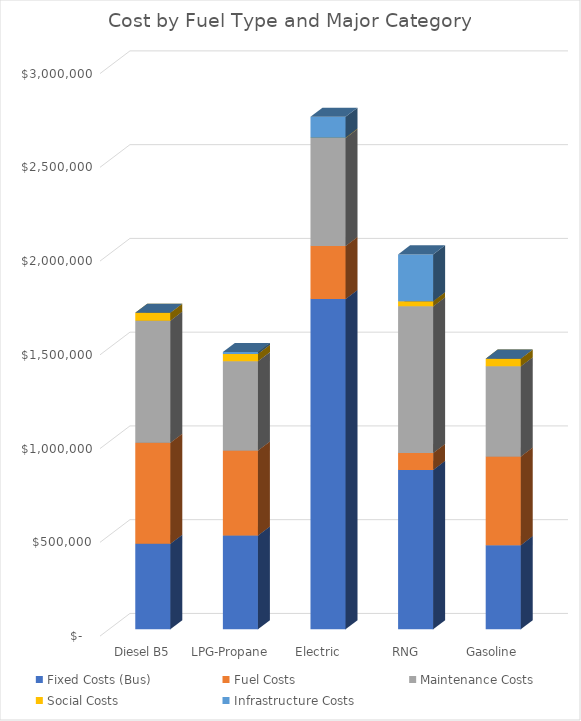
| Category | Fixed Costs (Bus)  | Fuel Costs | Maintenance Costs | Social Costs | Infrastructure Costs |
|---|---|---|---|---|---|
| Diesel B5 | 456250 | 538167.318 | 651594.668 | 41901.269 | 0 |
| LPG-Propane | 500500 | 452895.885 | 476381.177 | 38705.418 | 10500 |
| Electric | 1761250 | 283185.847 | 575443.68 | 1900.659 | 111250 |
| RNG | 850000 | 89883.453 | 782363.664 | 26934.457 | 250000 |
| Gasoline | 448750 | 472994.093 | 480653.654 | 40873.346 | 0 |